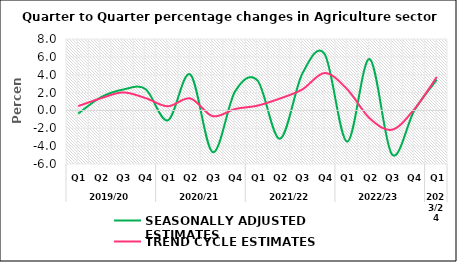
| Category | SEASONALLY ADJUSTED ESTIMATES | TREND CYCLE ESTIMATES |
|---|---|---|
| 0 | -0.354 | 0.486 |
| 1 | 1.459 | 1.349 |
| 2 | 2.337 | 2.017 |
| 3 | 2.4 | 1.387 |
| 4 | -1.112 | 0.464 |
| 5 | 4.024 | 1.343 |
| 6 | -4.669 | -0.641 |
| 7 | 2.132 | 0.158 |
| 8 | 3.353 | 0.536 |
| 9 | -3.17 | 1.332 |
| 10 | 4.119 | 2.35 |
| 11 | 6.285 | 4.192 |
| 12 | -3.497 | 2.382 |
| 13 | 5.754 | -0.869 |
| 14 | -4.929 | -2.161 |
| 15 | 0.008 | 0.149 |
| 16 | 3.441 | 3.748 |